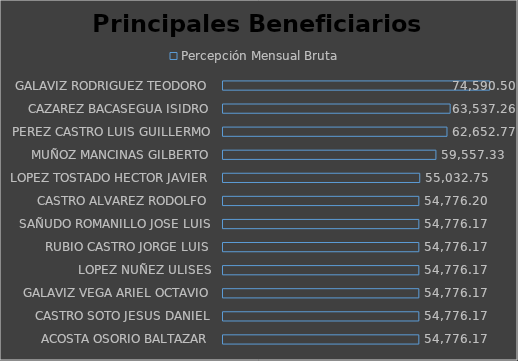
| Category | Percepción Mensual Bruta  |
|---|---|
| ACOSTA OSORIO BALTAZAR | 54776.172 |
| CASTRO SOTO JESUS DANIEL | 54776.172 |
| GALAVIZ VEGA ARIEL OCTAVIO | 54776.172 |
| LOPEZ NUÑEZ ULISES | 54776.172 |
| RUBIO CASTRO JORGE LUIS | 54776.172 |
| SAÑUDO ROMANILLO JOSE LUIS | 54776.172 |
| CASTRO ALVAREZ RODOLFO | 54776.198 |
| LOPEZ TOSTADO HECTOR JAVIER | 55032.753 |
| MUÑOZ MANCINAS GILBERTO | 59557.332 |
| PEREZ CASTRO LUIS GUILLERMO | 62652.772 |
| CAZAREZ BACASEGUA ISIDRO | 63537.264 |
| GALAVIZ RODRIGUEZ TEODORO | 74590.503 |